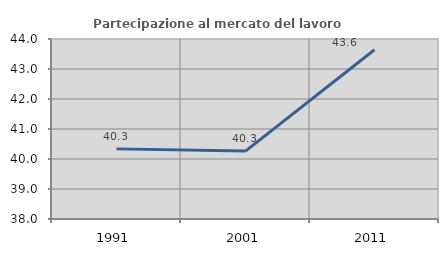
| Category | Partecipazione al mercato del lavoro  femminile |
|---|---|
| 1991.0 | 40.337 |
| 2001.0 | 40.264 |
| 2011.0 | 43.643 |